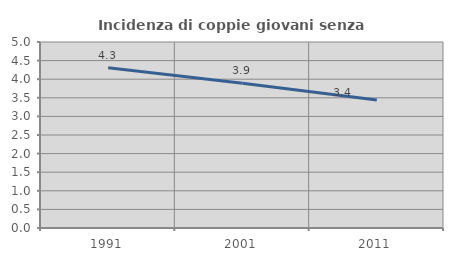
| Category | Incidenza di coppie giovani senza figli |
|---|---|
| 1991.0 | 4.309 |
| 2001.0 | 3.889 |
| 2011.0 | 3.443 |